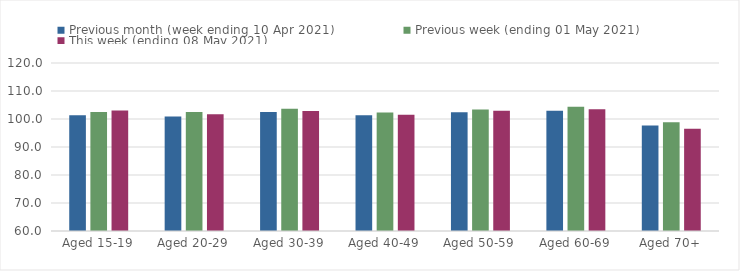
| Category | Previous month (week ending 10 Apr 2021) | Previous week (ending 01 May 2021) | This week (ending 08 May 2021) |
|---|---|---|---|
| Aged 15-19 | 101.31 | 102.49 | 103.07 |
| Aged 20-29 | 100.93 | 102.52 | 101.66 |
| Aged 30-39 | 102.53 | 103.69 | 102.82 |
| Aged 40-49 | 101.32 | 102.31 | 101.56 |
| Aged 50-59 | 102.42 | 103.43 | 102.92 |
| Aged 60-69 | 102.99 | 104.41 | 103.49 |
| Aged 70+ | 97.65 | 98.83 | 96.49 |